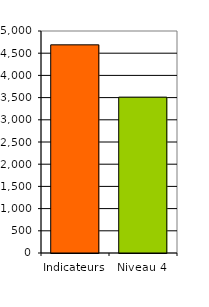
| Category | Series 0 |
|---|---|
| Indicateurs | 4688.343 |
| Niveau 4 | 3510.665 |